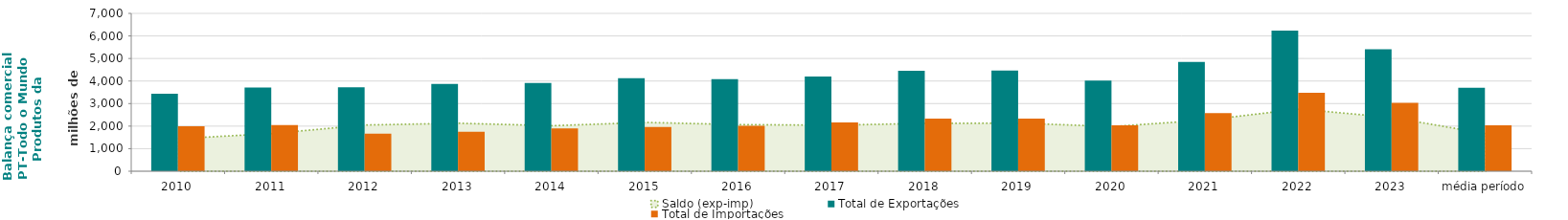
| Category | Total de Exportações  | Total de Importações  |
|---|---|---|
| 2010 | 3437.789 | 1992.856 |
| 2011 | 3715.67 | 2045.075 |
| 2012 | 3718.236 | 1668.747 |
| 2013 | 3874.977 | 1747.165 |
| 2014 | 3915.819 | 1898.536 |
| 2015 | 4127.679 | 1964.291 |
| 2016 | 4080.574 | 2013.498 |
| 2017 | 4197.892 | 2159.026 |
| 2018 | 4453.026 | 2330.485 |
| 2019 | 4467.779 | 2336.95 |
| 2020 | 4018.688 | 2036.07 |
| 2021 | 4849.341 | 2581.713 |
| 2022 | 6231.847 | 3475.696 |
| 2023 | 5413.309 | 3032.581 |
| média período | 3699.787 | 2037.926 |